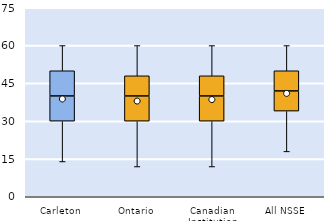
| Category | 25th | 50th | 75th |
|---|---|---|---|
| Carleton | 30 | 10 | 10 |
| Ontario | 30 | 10 | 8 |
| Canadian Institution | 30 | 10 | 8 |
| All NSSE | 34 | 8 | 8 |